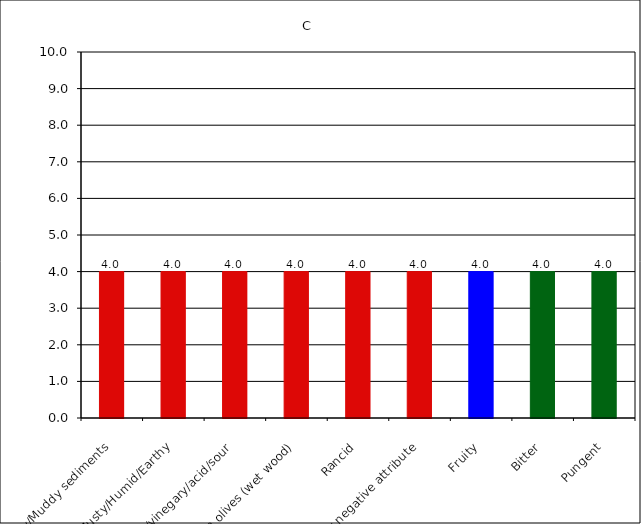
| Category | C |
|---|---|
| Fusty/Muddy sediments | 4 |
| Musty/Humid/Earthy | 4 |
| Winey/vinegary/acid/sour | 4 |
| Frostbitten olives (wet wood) | 4 |
| Rancid | 4 |
| Other negative attribute | 4 |
| Fruity | 4 |
| Bitter | 4 |
| Pungent | 4 |